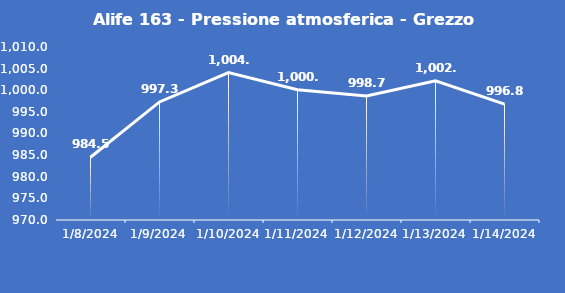
| Category | Alife 163 - Pressione atmosferica - Grezzo (hPa) |
|---|---|
| 1/8/24 | 984.5 |
| 1/9/24 | 997.3 |
| 1/10/24 | 1004.1 |
| 1/11/24 | 1000.1 |
| 1/12/24 | 998.7 |
| 1/13/24 | 1002.2 |
| 1/14/24 | 996.8 |